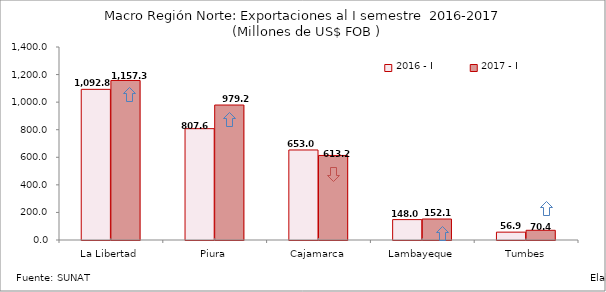
| Category | 2016 - I | 2017 - I |
|---|---|---|
| La Libertad | 1092.83 | 1157.311 |
| Piura | 807.597 | 979.157 |
| Cajamarca | 653.003 | 613.225 |
| Lambayeque | 148.02 | 152.141 |
| Tumbes | 56.934 | 70.41 |